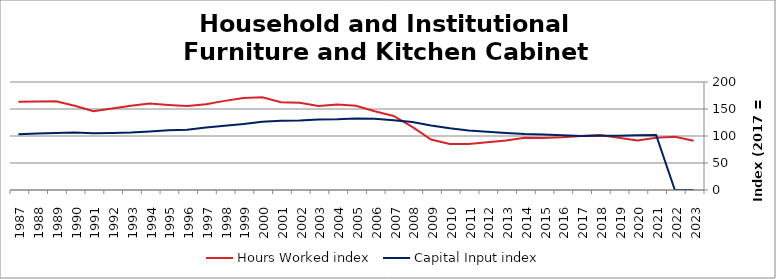
| Category | Hours Worked index | Capital Input index |
|---|---|---|
| 2023.0 | 91.116 | 0 |
| 2022.0 | 98.745 | 0 |
| 2021.0 | 96.914 | 101.838 |
| 2020.0 | 91.711 | 101.294 |
| 2019.0 | 96.65 | 100.63 |
| 2018.0 | 101.793 | 100.524 |
| 2017.0 | 100 | 100 |
| 2016.0 | 97.607 | 101.507 |
| 2015.0 | 96.307 | 102.588 |
| 2014.0 | 96.908 | 103.581 |
| 2013.0 | 91.833 | 105.597 |
| 2012.0 | 88.498 | 107.667 |
| 2011.0 | 85.115 | 110.4 |
| 2010.0 | 85.407 | 114.208 |
| 2009.0 | 93.37 | 119.563 |
| 2008.0 | 116.965 | 125.743 |
| 2007.0 | 137.039 | 129.363 |
| 2006.0 | 145.86 | 131.962 |
| 2005.0 | 156.092 | 132.226 |
| 2004.0 | 158.219 | 131.065 |
| 2003.0 | 155.683 | 130.714 |
| 2002.0 | 161.548 | 128.787 |
| 2001.0 | 162.584 | 128.174 |
| 2000.0 | 171.847 | 126.248 |
| 1999.0 | 170.526 | 122.119 |
| 1998.0 | 165.054 | 119.102 |
| 1997.0 | 159.005 | 115.526 |
| 1996.0 | 155.342 | 111.629 |
| 1995.0 | 157.543 | 110.54 |
| 1994.0 | 160.309 | 108.34 |
| 1993.0 | 155.936 | 106.271 |
| 1992.0 | 150.933 | 105.344 |
| 1991.0 | 145.817 | 105.133 |
| 1990.0 | 156.156 | 106.269 |
| 1989.0 | 164.367 | 105.415 |
| 1988.0 | 164.047 | 104.654 |
| 1987.0 | 163.62 | 103.054 |